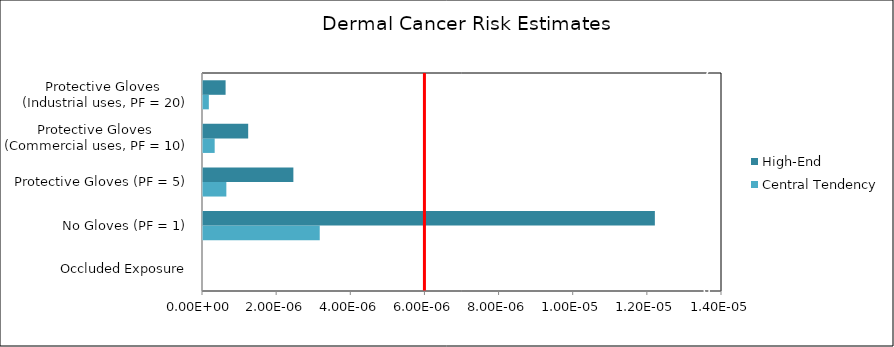
| Category | Central Tendency | High-End |
|---|---|---|
| Occluded Exposure | 0 | 0 |
| No Gloves (PF = 1) | 0 | 0 |
| Protective Gloves (PF = 5) | 0 | 0 |
| Protective Gloves 
(Commercial uses, PF = 10) | 0 | 0 |
| Protective Gloves 
(Industrial uses, PF = 20) | 0 | 0 |